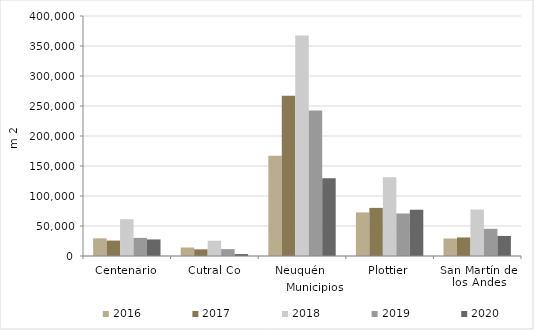
| Category | 2016 | 2017 | 2018 | 2019 | 2020 |
|---|---|---|---|---|---|
| Centenario | 29475 | 25718 | 61362 | 30214 | 27626 |
| Cutral Co | 14128 | 11102 | 25494 | 11420 | 3239 |
| Neuquén | 166902 | 267016 | 367390 | 242431 | 129729 |
| Plottier | 72636 | 80177 | 131318 | 70895 | 77120 |
| San Martín de los Andes | 29159 | 30918 | 77456 | 45330 | 33429 |